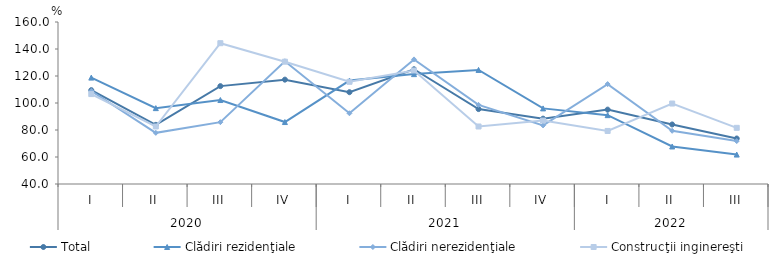
| Category | Total | Clădiri rezidenţiale | Clădiri nerezidenţiale | Construcţii inginereşti |
|---|---|---|---|---|
| 0 | 109.5 | 118.8 | 108.9 | 106.6 |
| 1 | 83.8 | 96.2 | 77.9 | 82.6 |
| 2 | 112.5 | 102.2 | 85.8 | 144.3 |
| 3 | 117.3 | 85.9 | 130.9 | 130.6 |
| 4 | 108 | 116.6 | 92.4 | 115.7 |
| 5 | 125 | 121.4 | 132.3 | 124.1 |
| 6 | 95.5 | 124.5 | 98.6 | 82.6 |
| 7 | 88.4 | 96 | 83.4 | 87 |
| 8 | 95.1 | 91 | 114 | 79.3 |
| 9 | 84.1 | 67.8 | 79.4 | 99.6 |
| 10 | 73.7 | 61.8 | 71.8 | 81.6 |